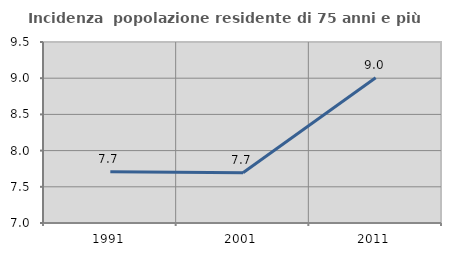
| Category | Incidenza  popolazione residente di 75 anni e più |
|---|---|
| 1991.0 | 7.709 |
| 2001.0 | 7.693 |
| 2011.0 | 9.006 |